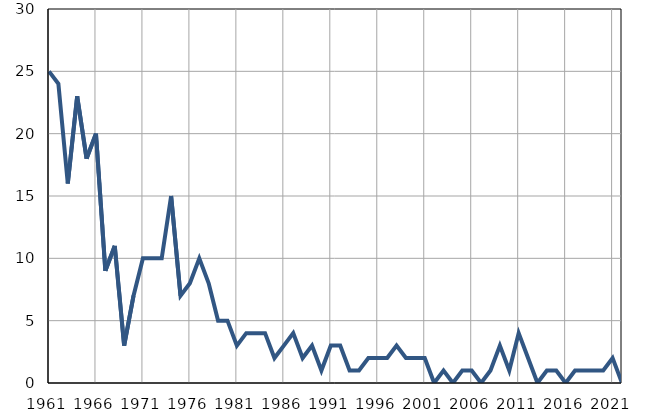
| Category | Умрла 
одојчад |
|---|---|
| 1961.0 | 25 |
| 1962.0 | 24 |
| 1963.0 | 16 |
| 1964.0 | 23 |
| 1965.0 | 18 |
| 1966.0 | 20 |
| 1967.0 | 9 |
| 1968.0 | 11 |
| 1969.0 | 3 |
| 1970.0 | 7 |
| 1971.0 | 10 |
| 1972.0 | 10 |
| 1973.0 | 10 |
| 1974.0 | 15 |
| 1975.0 | 7 |
| 1976.0 | 8 |
| 1977.0 | 10 |
| 1978.0 | 8 |
| 1979.0 | 5 |
| 1980.0 | 5 |
| 1981.0 | 3 |
| 1982.0 | 4 |
| 1983.0 | 4 |
| 1984.0 | 4 |
| 1985.0 | 2 |
| 1986.0 | 3 |
| 1987.0 | 4 |
| 1988.0 | 2 |
| 1989.0 | 3 |
| 1990.0 | 1 |
| 1991.0 | 3 |
| 1992.0 | 3 |
| 1993.0 | 1 |
| 1994.0 | 1 |
| 1995.0 | 2 |
| 1996.0 | 2 |
| 1997.0 | 2 |
| 1998.0 | 3 |
| 1999.0 | 2 |
| 2000.0 | 2 |
| 2001.0 | 2 |
| 2002.0 | 0 |
| 2003.0 | 1 |
| 2004.0 | 0 |
| 2005.0 | 1 |
| 2006.0 | 1 |
| 2007.0 | 0 |
| 2008.0 | 1 |
| 2009.0 | 3 |
| 2010.0 | 1 |
| 2011.0 | 4 |
| 2012.0 | 2 |
| 2013.0 | 0 |
| 2014.0 | 1 |
| 2015.0 | 1 |
| 2016.0 | 0 |
| 2017.0 | 1 |
| 2018.0 | 1 |
| 2019.0 | 1 |
| 2020.0 | 1 |
| 2021.0 | 2 |
| 2022.0 | 0 |